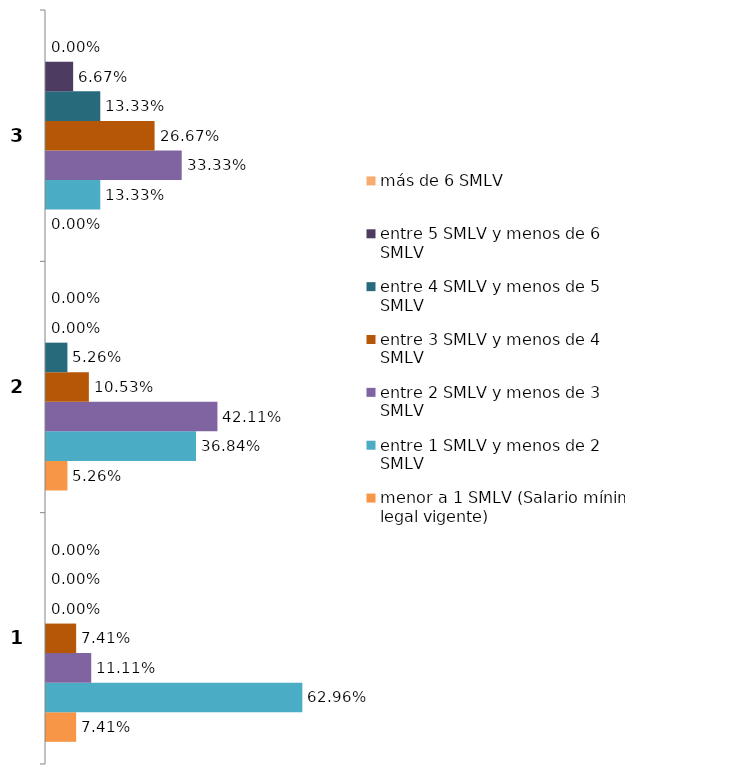
| Category | menor a 1 SMLV (Salario mínimo legal vigente) | entre 1 SMLV y menos de 2 SMLV | entre 2 SMLV y menos de 3 SMLV | entre 3 SMLV y menos de 4 SMLV | entre 4 SMLV y menos de 5 SMLV | entre 5 SMLV y menos de 6 SMLV | más de 6 SMLV |
|---|---|---|---|---|---|---|---|
| 0 | 0.074 | 0.63 | 0.111 | 0.074 | 0 | 0 | 0 |
| 1 | 0.053 | 0.368 | 0.421 | 0.105 | 0.053 | 0 | 0 |
| 2 | 0 | 0.133 | 0.333 | 0.267 | 0.133 | 0.067 | 0 |